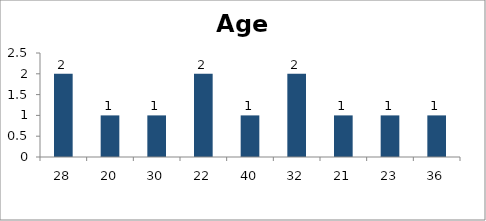
| Category | Age |
|---|---|
| 28.0 | 2 |
| 20.0 | 1 |
| 30.0 | 1 |
| 22.0 | 2 |
| 40.0 | 1 |
| 32.0 | 2 |
| 21.0 | 1 |
| 23.0 | 1 |
| 36.0 | 1 |